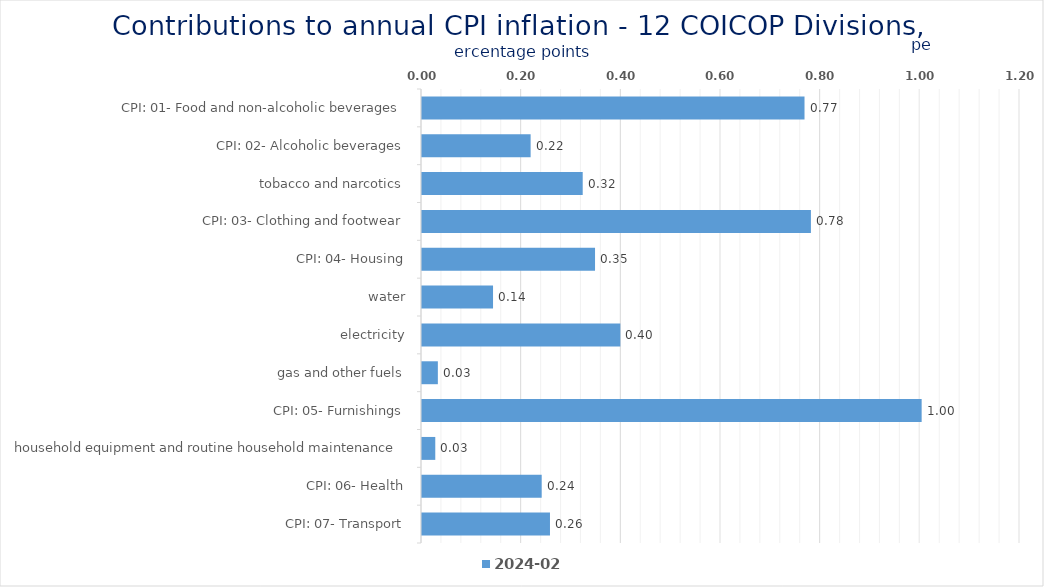
| Category | 2024-02 |
|---|---|
| CPI: 01- Food and non-alcoholic beverages | 0.768 |
| CPI: 02- Alcoholic beverages, tobacco and narcotics | 0.218 |
| CPI: 03- Clothing and footwear | 0.322 |
| CPI: 04- Housing, water, electricity, gas and other fuels | 0.78 |
| CPI: 05- Furnishings, household equipment and routine household maintenance | 0.347 |
| CPI: 06- Health | 0.143 |
| CPI: 07- Transport | 0.398 |
| CPI: 08- Communication | 0.032 |
| CPI: 09- Recreation and culture | 1.003 |
| CPI: 10- Education | 0.027 |
| CPI: 11- Restaurants and hotels | 0.24 |
| CPI: 12- Miscellaneous goods and services | 0.257 |